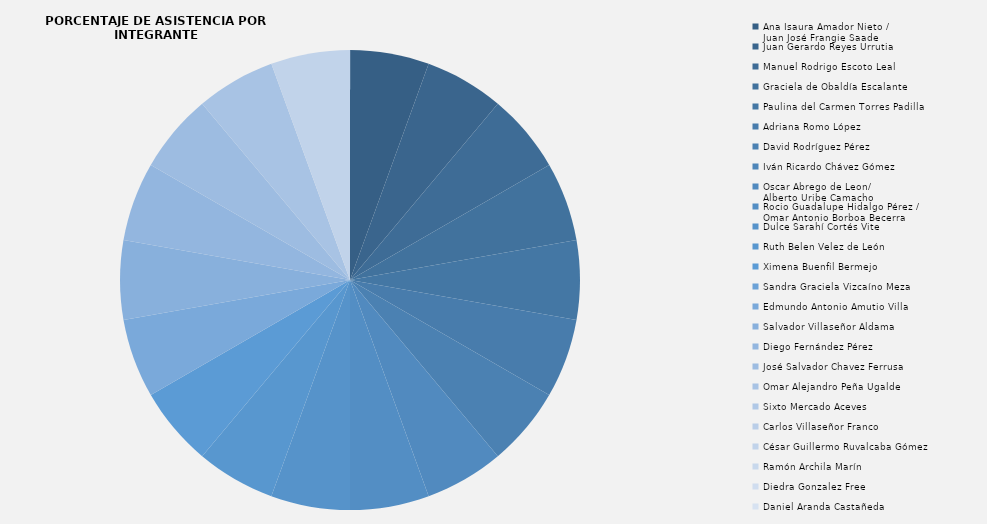
| Category | Series 0 |
|---|---|
| Ana Isaura Amador Nieto /
Juan José Frangie Saade | 1 |
| Juan Gerardo Reyes Urrutia | 1 |
| Manuel Rodrigo Escoto Leal | 1 |
| Graciela de Obaldía Escalante | 1 |
| Paulina del Carmen Torres Padilla  | 1 |
| Adriana Romo López | 1 |
| David Rodríguez Pérez | 1 |
| Iván Ricardo Chávez Gómez | 0 |
| Oscar Abrego de Leon/ 
Alberto Uribe Camacho | 1 |
| Rocio Guadalupe Hidalgo Pérez /
Omar Antonio Borboa Becerra | 1 |
| Dulce Sarahí Cortés Vite | 1 |
| Ruth Belen Velez de León | 1 |
| Ximena Buenfil Bermejo | 1 |
| Sandra Graciela Vizcaíno Meza | 0 |
| Edmundo Antonio Amutio Villa | 1 |
| Salvador Villaseñor Aldama | 1 |
| Diego Fernández Pérez | 1 |
| José Salvador Chavez Ferrusa | 1 |
| Omar Alejandro Peña Ugalde | 1 |
| Sixto Mercado Aceves | 0 |
| Carlos Villaseñor Franco | 0 |
| César Guillermo Ruvalcaba Gómez | 1 |
| Ramón Archila Marín | 0 |
| Diedra Gonzalez Free | 0 |
| Daniel Aranda Castañeda | 0 |